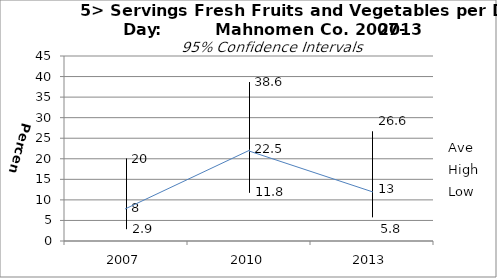
| Category | Ave | High | Low |
|---|---|---|---|
| 2007.0 | 8 | 20 | 2.9 |
| 2010.0 | 22.5 | 38.6 | 11.8 |
| 2013.0 | 13 | 26.6 | 5.8 |